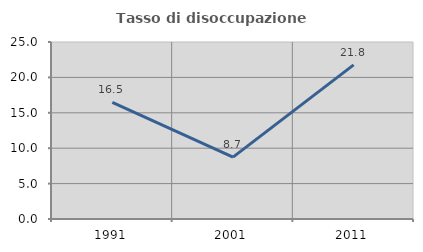
| Category | Tasso di disoccupazione giovanile  |
|---|---|
| 1991.0 | 16.477 |
| 2001.0 | 8.743 |
| 2011.0 | 21.771 |